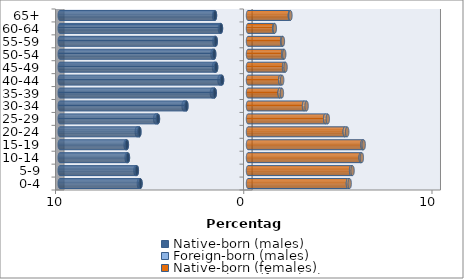
| Category | Native-born (males) | Foreign-born (males) | Native-born (females) | Foreign-born (females) |
|---|---|---|---|---|
| 0-4 | -5.711 | -0.084 | 5.31 | 0.092 |
| 5-9 | -5.905 | -0.072 | 5.477 | 0.077 |
| 10-14 | -6.379 | -0.068 | 5.986 | 0.062 |
| 15-19 | -6.435 | -0.068 | 6.083 | 0.063 |
| 20-24 | -5.769 | -0.137 | 5.14 | 0.129 |
| 25-29 | -4.784 | -0.144 | 4.101 | 0.139 |
| 30-34 | -3.273 | -0.148 | 2.977 | 0.135 |
| 35-39 | -1.768 | -0.149 | 1.68 | 0.12 |
| 40-44 | -1.379 | -0.134 | 1.714 | 0.1 |
| 45-49 | -1.694 | -0.11 | 1.917 | 0.078 |
| 50-54 | -1.796 | -0.089 | 1.869 | 0.056 |
| 55-59 | -1.714 | -0.068 | 1.815 | 0.039 |
| 60-64 | -1.437 | -0.056 | 1.396 | 0.024 |
| 65+ | -1.755 | -0.043 | 2.226 | 0.027 |